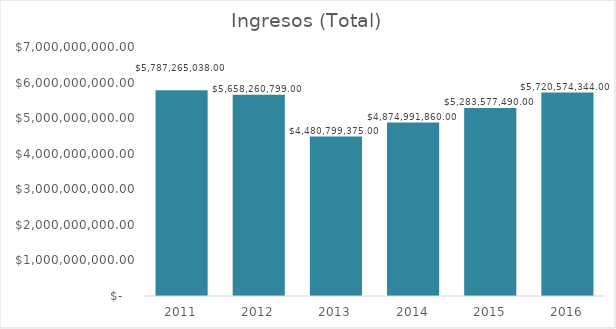
| Category | INGRESOS (TOTAL) |
|---|---|
| 2011.0 | 5787265038 |
| 2012.0 | 5658260799 |
| 2013.0 | 4480799375 |
| 2014.0 | 4874991860 |
| 2015.0 | 5283577490 |
| 2016.0 | 5720574344 |